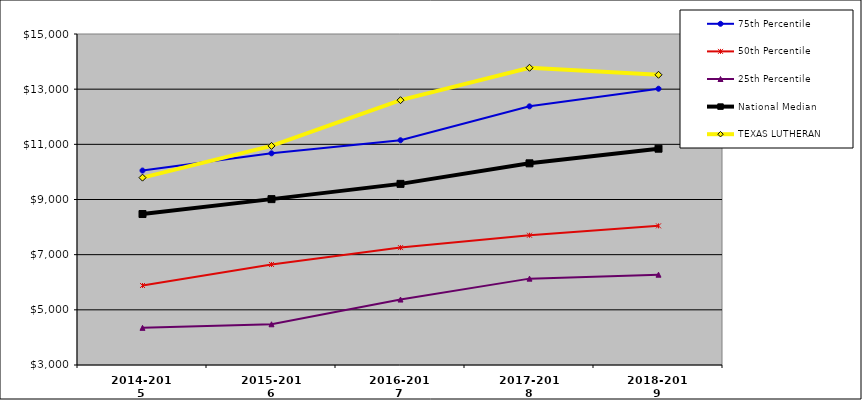
| Category | 75th Percentile | 50th Percentile | 25th Percentile | National Median | TEXAS LUTHERAN |
|---|---|---|---|---|---|
| 2014-2015 | 10049.507 | 5882.501 | 4347.213 | 8473.314 | 9792.02 |
| 2015-2016 | 10674.268 | 6644.568 | 4476.227 | 9013.486 | 10943.363 |
| 2016-2017 | 11147.884 | 7255.571 | 5372.413 | 9566.64 | 12600.824 |
| 2017-2018 | 12377.014 | 7704.307 | 6131.213 | 10311.147 | 13775.86 |
| 2018-2019 | 13015.189 | 8044.239 | 6273.722 | 10842.044 | 13520.988 |